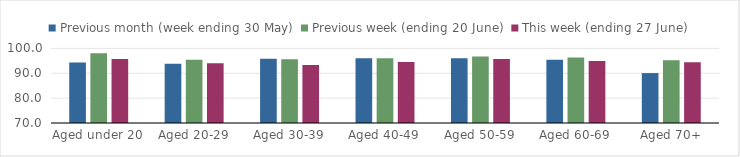
| Category | Previous month (week ending 30 May) | Previous week (ending 20 June) | This week (ending 27 June) |
|---|---|---|---|
| Aged under 20 | 94.315 | 98.042 | 95.755 |
| Aged 20-29 | 93.831 | 95.411 | 94.067 |
| Aged 30-39 | 95.851 | 95.599 | 93.316 |
| Aged 40-49 | 96.032 | 96.095 | 94.515 |
| Aged 50-59 | 96.09 | 96.712 | 95.721 |
| Aged 60-69 | 95.479 | 96.36 | 94.98 |
| Aged 70+ | 90.084 | 95.294 | 94.43 |